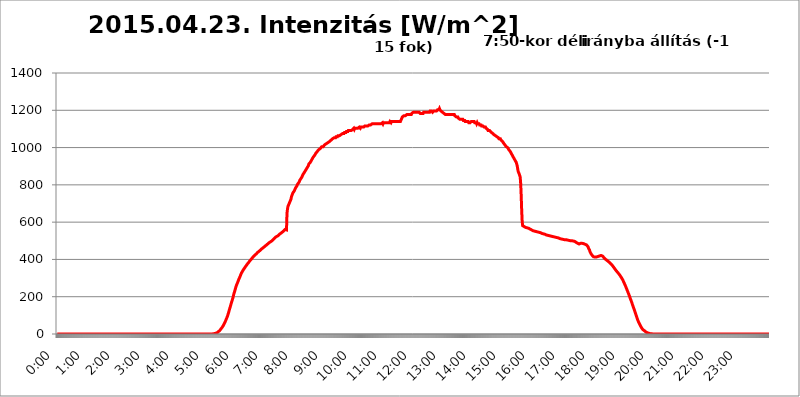
| Category | 2015.04.23. Intenzitás [W/m^2] |
|---|---|
| 0.0 | -0.256 |
| 0.0006944444444444445 | -0.256 |
| 0.001388888888888889 | -0.256 |
| 0.0020833333333333333 | -0.256 |
| 0.002777777777777778 | -0.256 |
| 0.003472222222222222 | -0.256 |
| 0.004166666666666667 | -0.256 |
| 0.004861111111111111 | -0.256 |
| 0.005555555555555556 | -0.256 |
| 0.0062499999999999995 | -0.256 |
| 0.006944444444444444 | -0.256 |
| 0.007638888888888889 | -0.256 |
| 0.008333333333333333 | -0.256 |
| 0.009027777777777779 | -0.256 |
| 0.009722222222222222 | -0.256 |
| 0.010416666666666666 | -0.256 |
| 0.011111111111111112 | -0.256 |
| 0.011805555555555555 | -0.256 |
| 0.012499999999999999 | -0.256 |
| 0.013194444444444444 | -0.256 |
| 0.013888888888888888 | -0.256 |
| 0.014583333333333332 | -0.256 |
| 0.015277777777777777 | -0.256 |
| 0.015972222222222224 | -0.256 |
| 0.016666666666666666 | -0.256 |
| 0.017361111111111112 | -0.256 |
| 0.018055555555555557 | -0.256 |
| 0.01875 | -0.256 |
| 0.019444444444444445 | -0.256 |
| 0.02013888888888889 | -0.256 |
| 0.020833333333333332 | -0.256 |
| 0.02152777777777778 | -0.256 |
| 0.022222222222222223 | -0.256 |
| 0.02291666666666667 | -0.256 |
| 0.02361111111111111 | -0.256 |
| 0.024305555555555556 | -0.256 |
| 0.024999999999999998 | -0.256 |
| 0.025694444444444447 | -0.256 |
| 0.02638888888888889 | -0.256 |
| 0.027083333333333334 | -0.256 |
| 0.027777777777777776 | -0.256 |
| 0.02847222222222222 | -0.256 |
| 0.029166666666666664 | -0.256 |
| 0.029861111111111113 | -0.256 |
| 0.030555555555555555 | -0.256 |
| 0.03125 | -0.256 |
| 0.03194444444444445 | -0.256 |
| 0.03263888888888889 | -0.256 |
| 0.03333333333333333 | -0.256 |
| 0.034027777777777775 | -0.256 |
| 0.034722222222222224 | -0.256 |
| 0.035416666666666666 | -0.256 |
| 0.036111111111111115 | -0.256 |
| 0.03680555555555556 | -0.256 |
| 0.0375 | -0.256 |
| 0.03819444444444444 | -0.256 |
| 0.03888888888888889 | -0.256 |
| 0.03958333333333333 | -0.256 |
| 0.04027777777777778 | -0.256 |
| 0.04097222222222222 | -0.256 |
| 0.041666666666666664 | -0.256 |
| 0.042361111111111106 | -0.256 |
| 0.04305555555555556 | -0.256 |
| 0.043750000000000004 | -0.256 |
| 0.044444444444444446 | -0.256 |
| 0.04513888888888889 | -0.256 |
| 0.04583333333333334 | -0.256 |
| 0.04652777777777778 | -0.256 |
| 0.04722222222222222 | -0.256 |
| 0.04791666666666666 | -0.256 |
| 0.04861111111111111 | -0.256 |
| 0.049305555555555554 | -0.256 |
| 0.049999999999999996 | -0.256 |
| 0.05069444444444445 | -0.256 |
| 0.051388888888888894 | -0.256 |
| 0.052083333333333336 | -0.256 |
| 0.05277777777777778 | -0.256 |
| 0.05347222222222222 | -0.256 |
| 0.05416666666666667 | -0.256 |
| 0.05486111111111111 | -0.256 |
| 0.05555555555555555 | -0.256 |
| 0.05625 | -0.256 |
| 0.05694444444444444 | -0.256 |
| 0.057638888888888885 | -0.256 |
| 0.05833333333333333 | -0.256 |
| 0.05902777777777778 | -0.256 |
| 0.059722222222222225 | -0.256 |
| 0.06041666666666667 | -0.256 |
| 0.061111111111111116 | -0.256 |
| 0.06180555555555556 | -0.256 |
| 0.0625 | -0.256 |
| 0.06319444444444444 | -0.256 |
| 0.06388888888888888 | -0.256 |
| 0.06458333333333334 | -0.256 |
| 0.06527777777777778 | -0.256 |
| 0.06597222222222222 | -0.256 |
| 0.06666666666666667 | -0.256 |
| 0.06736111111111111 | -0.256 |
| 0.06805555555555555 | -0.256 |
| 0.06874999999999999 | -0.256 |
| 0.06944444444444443 | -0.256 |
| 0.07013888888888889 | -0.256 |
| 0.07083333333333333 | -0.256 |
| 0.07152777777777779 | -0.256 |
| 0.07222222222222223 | -0.256 |
| 0.07291666666666667 | -0.256 |
| 0.07361111111111111 | -0.256 |
| 0.07430555555555556 | -0.256 |
| 0.075 | -0.256 |
| 0.07569444444444444 | -0.256 |
| 0.0763888888888889 | -0.256 |
| 0.07708333333333334 | -0.256 |
| 0.07777777777777778 | -0.256 |
| 0.07847222222222222 | -0.256 |
| 0.07916666666666666 | -0.256 |
| 0.0798611111111111 | -0.256 |
| 0.08055555555555556 | -0.256 |
| 0.08125 | -0.256 |
| 0.08194444444444444 | -0.256 |
| 0.08263888888888889 | -0.256 |
| 0.08333333333333333 | -0.256 |
| 0.08402777777777777 | -0.256 |
| 0.08472222222222221 | -0.256 |
| 0.08541666666666665 | -0.256 |
| 0.08611111111111112 | -0.256 |
| 0.08680555555555557 | -0.256 |
| 0.08750000000000001 | -0.256 |
| 0.08819444444444445 | -0.256 |
| 0.08888888888888889 | -0.256 |
| 0.08958333333333333 | -0.256 |
| 0.09027777777777778 | -0.256 |
| 0.09097222222222222 | -0.256 |
| 0.09166666666666667 | -0.256 |
| 0.09236111111111112 | -0.256 |
| 0.09305555555555556 | -0.256 |
| 0.09375 | -0.256 |
| 0.09444444444444444 | -0.256 |
| 0.09513888888888888 | -0.256 |
| 0.09583333333333333 | -0.256 |
| 0.09652777777777777 | -0.256 |
| 0.09722222222222222 | -0.256 |
| 0.09791666666666667 | -0.256 |
| 0.09861111111111111 | -0.256 |
| 0.09930555555555555 | -0.256 |
| 0.09999999999999999 | -0.256 |
| 0.10069444444444443 | -0.256 |
| 0.1013888888888889 | -0.256 |
| 0.10208333333333335 | -0.256 |
| 0.10277777777777779 | -0.256 |
| 0.10347222222222223 | -0.256 |
| 0.10416666666666667 | -0.256 |
| 0.10486111111111111 | -0.256 |
| 0.10555555555555556 | -0.256 |
| 0.10625 | -0.256 |
| 0.10694444444444444 | -0.256 |
| 0.1076388888888889 | -0.256 |
| 0.10833333333333334 | -0.256 |
| 0.10902777777777778 | -0.256 |
| 0.10972222222222222 | -0.256 |
| 0.1111111111111111 | -0.256 |
| 0.11180555555555556 | -0.256 |
| 0.11180555555555556 | -0.256 |
| 0.1125 | -0.256 |
| 0.11319444444444444 | -0.256 |
| 0.11388888888888889 | -0.256 |
| 0.11458333333333333 | -0.256 |
| 0.11527777777777777 | -0.256 |
| 0.11597222222222221 | -0.256 |
| 0.11666666666666665 | -0.256 |
| 0.1173611111111111 | -0.256 |
| 0.11805555555555557 | -0.256 |
| 0.11944444444444445 | -0.256 |
| 0.12013888888888889 | -0.256 |
| 0.12083333333333333 | -0.256 |
| 0.12152777777777778 | -0.256 |
| 0.12222222222222223 | -0.256 |
| 0.12291666666666667 | -0.256 |
| 0.12291666666666667 | -0.256 |
| 0.12361111111111112 | -0.256 |
| 0.12430555555555556 | -0.256 |
| 0.125 | -0.256 |
| 0.12569444444444444 | -0.256 |
| 0.12638888888888888 | -0.256 |
| 0.12708333333333333 | -0.256 |
| 0.16875 | -0.256 |
| 0.12847222222222224 | -0.256 |
| 0.12916666666666668 | -0.256 |
| 0.12986111111111112 | -0.256 |
| 0.13055555555555556 | -0.256 |
| 0.13125 | -0.256 |
| 0.13194444444444445 | -0.256 |
| 0.1326388888888889 | -0.256 |
| 0.13333333333333333 | -0.256 |
| 0.13402777777777777 | -0.256 |
| 0.13402777777777777 | -0.256 |
| 0.13472222222222222 | -0.256 |
| 0.13541666666666666 | -0.256 |
| 0.1361111111111111 | -0.256 |
| 0.13749999999999998 | -0.256 |
| 0.13819444444444443 | -0.256 |
| 0.1388888888888889 | -0.256 |
| 0.13958333333333334 | -0.256 |
| 0.14027777777777778 | -0.256 |
| 0.14097222222222222 | -0.256 |
| 0.14166666666666666 | -0.256 |
| 0.1423611111111111 | -0.256 |
| 0.14305555555555557 | -0.256 |
| 0.14375000000000002 | -0.256 |
| 0.14444444444444446 | -0.256 |
| 0.1451388888888889 | -0.256 |
| 0.1451388888888889 | -0.256 |
| 0.14652777777777778 | -0.256 |
| 0.14722222222222223 | -0.256 |
| 0.14791666666666667 | -0.256 |
| 0.1486111111111111 | -0.256 |
| 0.14930555555555555 | -0.256 |
| 0.15 | -0.256 |
| 0.15069444444444444 | -0.256 |
| 0.15138888888888888 | -0.256 |
| 0.15208333333333332 | -0.256 |
| 0.15277777777777776 | -0.256 |
| 0.15347222222222223 | -0.256 |
| 0.15416666666666667 | -0.256 |
| 0.15486111111111112 | -0.256 |
| 0.15555555555555556 | -0.256 |
| 0.15625 | -0.256 |
| 0.15694444444444444 | -0.256 |
| 0.15763888888888888 | -0.256 |
| 0.15833333333333333 | -0.256 |
| 0.15902777777777777 | -0.256 |
| 0.15972222222222224 | -0.256 |
| 0.16041666666666668 | -0.256 |
| 0.16111111111111112 | -0.256 |
| 0.16180555555555556 | -0.256 |
| 0.1625 | -0.256 |
| 0.16319444444444445 | -0.256 |
| 0.1638888888888889 | -0.256 |
| 0.16458333333333333 | -0.256 |
| 0.16527777777777777 | -0.256 |
| 0.16597222222222222 | -0.256 |
| 0.16666666666666666 | -0.256 |
| 0.1673611111111111 | -0.256 |
| 0.16805555555555554 | -0.256 |
| 0.16874999999999998 | -0.256 |
| 0.16944444444444443 | -0.256 |
| 0.17013888888888887 | -0.256 |
| 0.1708333333333333 | -0.256 |
| 0.17152777777777775 | -0.256 |
| 0.17222222222222225 | -0.256 |
| 0.1729166666666667 | -0.256 |
| 0.17361111111111113 | -0.256 |
| 0.17430555555555557 | -0.256 |
| 0.17500000000000002 | -0.256 |
| 0.17569444444444446 | -0.256 |
| 0.1763888888888889 | -0.256 |
| 0.17708333333333334 | -0.256 |
| 0.17777777777777778 | -0.256 |
| 0.17847222222222223 | -0.256 |
| 0.17916666666666667 | -0.256 |
| 0.1798611111111111 | -0.256 |
| 0.18055555555555555 | -0.256 |
| 0.18125 | -0.256 |
| 0.18194444444444444 | -0.256 |
| 0.1826388888888889 | -0.256 |
| 0.18333333333333335 | -0.256 |
| 0.1840277777777778 | -0.256 |
| 0.18472222222222223 | -0.256 |
| 0.18541666666666667 | -0.256 |
| 0.18611111111111112 | -0.256 |
| 0.18680555555555556 | -0.256 |
| 0.1875 | -0.256 |
| 0.18819444444444444 | -0.256 |
| 0.18888888888888888 | -0.256 |
| 0.18958333333333333 | -0.256 |
| 0.19027777777777777 | -0.256 |
| 0.1909722222222222 | -0.256 |
| 0.19166666666666665 | -0.256 |
| 0.19236111111111112 | -0.256 |
| 0.19305555555555554 | -0.256 |
| 0.19375 | -0.256 |
| 0.19444444444444445 | -0.256 |
| 0.1951388888888889 | -0.256 |
| 0.19583333333333333 | -0.256 |
| 0.19652777777777777 | -0.256 |
| 0.19722222222222222 | -0.256 |
| 0.19791666666666666 | -0.256 |
| 0.1986111111111111 | -0.256 |
| 0.19930555555555554 | -0.256 |
| 0.19999999999999998 | -0.256 |
| 0.20069444444444443 | -0.256 |
| 0.20138888888888887 | -0.256 |
| 0.2020833333333333 | -0.256 |
| 0.2027777777777778 | -0.256 |
| 0.2034722222222222 | -0.256 |
| 0.2041666666666667 | -0.256 |
| 0.20486111111111113 | -0.256 |
| 0.20555555555555557 | -0.256 |
| 0.20625000000000002 | -0.256 |
| 0.20694444444444446 | -0.256 |
| 0.2076388888888889 | -0.256 |
| 0.20833333333333334 | -0.256 |
| 0.20902777777777778 | -0.256 |
| 0.20972222222222223 | -0.256 |
| 0.21041666666666667 | -0.256 |
| 0.2111111111111111 | -0.256 |
| 0.21180555555555555 | -0.256 |
| 0.2125 | -0.256 |
| 0.21319444444444444 | -0.256 |
| 0.2138888888888889 | -0.256 |
| 0.21458333333333335 | -0.256 |
| 0.2152777777777778 | -0.256 |
| 0.21597222222222223 | -0.256 |
| 0.21666666666666667 | -0.256 |
| 0.21736111111111112 | -0.256 |
| 0.21805555555555556 | 1.09 |
| 0.21875 | 1.09 |
| 0.21944444444444444 | 1.09 |
| 0.22013888888888888 | 1.09 |
| 0.22083333333333333 | 2.439 |
| 0.22152777777777777 | 3.791 |
| 0.2222222222222222 | 3.791 |
| 0.22291666666666665 | 5.146 |
| 0.2236111111111111 | 6.503 |
| 0.22430555555555556 | 7.862 |
| 0.225 | 9.225 |
| 0.22569444444444445 | 11.956 |
| 0.2263888888888889 | 13.325 |
| 0.22708333333333333 | 16.069 |
| 0.22777777777777777 | 18.822 |
| 0.22847222222222222 | 21.582 |
| 0.22916666666666666 | 25.736 |
| 0.2298611111111111 | 28.514 |
| 0.23055555555555554 | 31.297 |
| 0.23124999999999998 | 35.483 |
| 0.23194444444444443 | 39.68 |
| 0.23263888888888887 | 43.886 |
| 0.2333333333333333 | 48.1 |
| 0.2340277777777778 | 53.73 |
| 0.2347222222222222 | 59.368 |
| 0.2354166666666667 | 65.012 |
| 0.23611111111111113 | 70.658 |
| 0.23680555555555557 | 77.715 |
| 0.23750000000000002 | 83.356 |
| 0.23819444444444446 | 90.399 |
| 0.2388888888888889 | 97.427 |
| 0.23958333333333334 | 105.834 |
| 0.24027777777777778 | 114.207 |
| 0.24097222222222223 | 123.922 |
| 0.24166666666666667 | 133.57 |
| 0.2423611111111111 | 141.782 |
| 0.24305555555555555 | 151.286 |
| 0.24375 | 160.704 |
| 0.24444444444444446 | 170.029 |
| 0.24513888888888888 | 177.946 |
| 0.24583333333333335 | 187.091 |
| 0.2465277777777778 | 196.135 |
| 0.24722222222222223 | 207.615 |
| 0.24791666666666667 | 217.681 |
| 0.24861111111111112 | 226.383 |
| 0.24930555555555556 | 234.99 |
| 0.25 | 244.717 |
| 0.25069444444444444 | 254.333 |
| 0.2513888888888889 | 261.48 |
| 0.2520833333333333 | 268.576 |
| 0.25277777777777777 | 274.454 |
| 0.2534722222222222 | 281.471 |
| 0.25416666666666665 | 288.455 |
| 0.2548611111111111 | 295.413 |
| 0.2555555555555556 | 301.198 |
| 0.25625000000000003 | 306.974 |
| 0.2569444444444445 | 313.904 |
| 0.2576388888888889 | 320.84 |
| 0.25833333333333336 | 326.633 |
| 0.2590277777777778 | 331.279 |
| 0.25972222222222224 | 335.941 |
| 0.2604166666666667 | 340.62 |
| 0.2611111111111111 | 345.322 |
| 0.26180555555555557 | 348.865 |
| 0.2625 | 352.423 |
| 0.26319444444444445 | 357.196 |
| 0.2638888888888889 | 360.798 |
| 0.26458333333333334 | 364.422 |
| 0.2652777777777778 | 368.07 |
| 0.2659722222222222 | 371.742 |
| 0.26666666666666666 | 375.442 |
| 0.2673611111111111 | 377.925 |
| 0.26805555555555555 | 381.674 |
| 0.26875 | 385.455 |
| 0.26944444444444443 | 389.27 |
| 0.2701388888888889 | 391.834 |
| 0.2708333333333333 | 395.711 |
| 0.27152777777777776 | 398.318 |
| 0.2722222222222222 | 400.943 |
| 0.27291666666666664 | 404.916 |
| 0.2736111111111111 | 407.589 |
| 0.2743055555555555 | 411.638 |
| 0.27499999999999997 | 414.364 |
| 0.27569444444444446 | 417.112 |
| 0.27638888888888885 | 419.883 |
| 0.27708333333333335 | 422.678 |
| 0.2777777777777778 | 424.085 |
| 0.27847222222222223 | 426.916 |
| 0.2791666666666667 | 429.773 |
| 0.2798611111111111 | 432.656 |
| 0.28055555555555556 | 435.566 |
| 0.28125 | 438.503 |
| 0.28194444444444444 | 439.982 |
| 0.2826388888888889 | 442.962 |
| 0.2833333333333333 | 444.463 |
| 0.28402777777777777 | 445.971 |
| 0.2847222222222222 | 449.011 |
| 0.28541666666666665 | 450.542 |
| 0.28611111111111115 | 453.629 |
| 0.28680555555555554 | 456.747 |
| 0.28750000000000003 | 458.318 |
| 0.2881944444444445 | 461.486 |
| 0.2888888888888889 | 463.083 |
| 0.28958333333333336 | 464.688 |
| 0.2902777777777778 | 467.925 |
| 0.29097222222222224 | 469.557 |
| 0.2916666666666667 | 472.848 |
| 0.2923611111111111 | 474.507 |
| 0.29305555555555557 | 476.176 |
| 0.29375 | 479.541 |
| 0.29444444444444445 | 481.238 |
| 0.2951388888888889 | 482.945 |
| 0.29583333333333334 | 484.662 |
| 0.2965277777777778 | 486.389 |
| 0.2972222222222222 | 489.873 |
| 0.29791666666666666 | 491.63 |
| 0.2986111111111111 | 493.398 |
| 0.29930555555555555 | 495.176 |
| 0.3 | 496.965 |
| 0.30069444444444443 | 498.764 |
| 0.3013888888888889 | 500.575 |
| 0.3020833333333333 | 504.229 |
| 0.30277777777777776 | 506.072 |
| 0.3034722222222222 | 507.927 |
| 0.30416666666666664 | 511.671 |
| 0.3048611111111111 | 513.561 |
| 0.3055555555555555 | 517.375 |
| 0.30624999999999997 | 519.3 |
| 0.3069444444444444 | 521.237 |
| 0.3076388888888889 | 523.186 |
| 0.30833333333333335 | 525.148 |
| 0.3090277777777778 | 527.122 |
| 0.30972222222222223 | 527.122 |
| 0.3104166666666667 | 531.108 |
| 0.3111111111111111 | 533.12 |
| 0.31180555555555556 | 535.145 |
| 0.3125 | 537.182 |
| 0.31319444444444444 | 539.234 |
| 0.3138888888888889 | 539.234 |
| 0.3145833333333333 | 543.376 |
| 0.31527777777777777 | 545.467 |
| 0.3159722222222222 | 547.572 |
| 0.31666666666666665 | 549.691 |
| 0.31736111111111115 | 551.823 |
| 0.31805555555555554 | 556.131 |
| 0.31875000000000003 | 556.131 |
| 0.3194444444444445 | 560.495 |
| 0.3201388888888889 | 560.495 |
| 0.32083333333333336 | 562.699 |
| 0.3215277777777778 | 558.305 |
| 0.32222222222222224 | 647.179 |
| 0.3229166666666667 | 670.078 |
| 0.3236111111111111 | 685.046 |
| 0.32430555555555557 | 691.18 |
| 0.325 | 697.399 |
| 0.32569444444444445 | 703.704 |
| 0.3263888888888889 | 710.098 |
| 0.32708333333333334 | 716.58 |
| 0.3277777777777778 | 723.153 |
| 0.3284722222222222 | 736.574 |
| 0.32916666666666666 | 743.425 |
| 0.3298611111111111 | 750.371 |
| 0.33055555555555555 | 757.414 |
| 0.33125 | 760.972 |
| 0.33194444444444443 | 764.555 |
| 0.3326388888888889 | 768.162 |
| 0.3333333333333333 | 775.451 |
| 0.3340277777777778 | 779.134 |
| 0.3347222222222222 | 786.575 |
| 0.3354166666666667 | 790.334 |
| 0.3361111111111111 | 794.119 |
| 0.3368055555555556 | 801.768 |
| 0.33749999999999997 | 805.632 |
| 0.33819444444444446 | 809.522 |
| 0.33888888888888885 | 813.439 |
| 0.33958333333333335 | 817.382 |
| 0.34027777777777773 | 825.351 |
| 0.34097222222222223 | 829.377 |
| 0.3416666666666666 | 833.43 |
| 0.3423611111111111 | 837.51 |
| 0.3430555555555555 | 841.619 |
| 0.34375 | 845.755 |
| 0.3444444444444445 | 854.113 |
| 0.3451388888888889 | 858.335 |
| 0.3458333333333334 | 858.335 |
| 0.34652777777777777 | 866.865 |
| 0.34722222222222227 | 871.173 |
| 0.34791666666666665 | 875.511 |
| 0.34861111111111115 | 879.878 |
| 0.34930555555555554 | 884.274 |
| 0.35000000000000003 | 888.701 |
| 0.3506944444444444 | 893.157 |
| 0.3513888888888889 | 897.643 |
| 0.3520833333333333 | 902.16 |
| 0.3527777777777778 | 911.285 |
| 0.3534722222222222 | 911.285 |
| 0.3541666666666667 | 915.893 |
| 0.3548611111111111 | 920.533 |
| 0.35555555555555557 | 925.203 |
| 0.35625 | 929.905 |
| 0.35694444444444445 | 934.639 |
| 0.3576388888888889 | 939.404 |
| 0.35833333333333334 | 944.201 |
| 0.3590277777777778 | 949.03 |
| 0.3597222222222222 | 949.03 |
| 0.36041666666666666 | 953.892 |
| 0.3611111111111111 | 958.785 |
| 0.36180555555555555 | 963.712 |
| 0.3625 | 968.671 |
| 0.36319444444444443 | 968.671 |
| 0.3638888888888889 | 973.663 |
| 0.3645833333333333 | 978.688 |
| 0.3652777777777778 | 983.747 |
| 0.3659722222222222 | 983.747 |
| 0.3666666666666667 | 988.839 |
| 0.3673611111111111 | 993.965 |
| 0.3680555555555556 | 993.965 |
| 0.36874999999999997 | 993.965 |
| 0.36944444444444446 | 999.125 |
| 0.37013888888888885 | 999.125 |
| 0.37083333333333335 | 1004.318 |
| 0.37152777777777773 | 1004.318 |
| 0.37222222222222223 | 1004.318 |
| 0.3729166666666666 | 1004.318 |
| 0.3736111111111111 | 1009.546 |
| 0.3743055555555555 | 1009.546 |
| 0.375 | 1014.809 |
| 0.3756944444444445 | 1014.809 |
| 0.3763888888888889 | 1014.809 |
| 0.3770833333333334 | 1020.106 |
| 0.37777777777777777 | 1020.106 |
| 0.37847222222222227 | 1025.437 |
| 0.37916666666666665 | 1025.437 |
| 0.37986111111111115 | 1025.437 |
| 0.38055555555555554 | 1025.437 |
| 0.38125000000000003 | 1030.804 |
| 0.3819444444444444 | 1030.804 |
| 0.3826388888888889 | 1036.206 |
| 0.3833333333333333 | 1036.206 |
| 0.3840277777777778 | 1036.206 |
| 0.3847222222222222 | 1041.644 |
| 0.3854166666666667 | 1041.644 |
| 0.3861111111111111 | 1047.117 |
| 0.38680555555555557 | 1047.117 |
| 0.3875 | 1047.117 |
| 0.38819444444444445 | 1052.625 |
| 0.3888888888888889 | 1052.625 |
| 0.38958333333333334 | 1052.625 |
| 0.3902777777777778 | 1052.625 |
| 0.3909722222222222 | 1058.17 |
| 0.39166666666666666 | 1058.17 |
| 0.3923611111111111 | 1058.17 |
| 0.39305555555555555 | 1058.17 |
| 0.39375 | 1063.751 |
| 0.39444444444444443 | 1063.751 |
| 0.3951388888888889 | 1063.751 |
| 0.3958333333333333 | 1063.751 |
| 0.3965277777777778 | 1063.751 |
| 0.3972222222222222 | 1063.751 |
| 0.3979166666666667 | 1069.368 |
| 0.3986111111111111 | 1069.368 |
| 0.3993055555555556 | 1069.368 |
| 0.39999999999999997 | 1075.021 |
| 0.40069444444444446 | 1075.021 |
| 0.40138888888888885 | 1075.021 |
| 0.40208333333333335 | 1075.021 |
| 0.40277777777777773 | 1080.711 |
| 0.40347222222222223 | 1080.711 |
| 0.4041666666666666 | 1080.711 |
| 0.4048611111111111 | 1080.711 |
| 0.4055555555555555 | 1086.439 |
| 0.40625 | 1086.439 |
| 0.4069444444444445 | 1086.439 |
| 0.4076388888888889 | 1086.439 |
| 0.4083333333333334 | 1092.203 |
| 0.40902777777777777 | 1092.203 |
| 0.40972222222222227 | 1092.203 |
| 0.41041666666666665 | 1092.203 |
| 0.41111111111111115 | 1092.203 |
| 0.41180555555555554 | 1092.203 |
| 0.41250000000000003 | 1092.203 |
| 0.4131944444444444 | 1092.203 |
| 0.4138888888888889 | 1092.203 |
| 0.4145833333333333 | 1098.004 |
| 0.4152777777777778 | 1098.004 |
| 0.4159722222222222 | 1103.843 |
| 0.4166666666666667 | 1098.004 |
| 0.4173611111111111 | 1103.843 |
| 0.41805555555555557 | 1103.843 |
| 0.41875 | 1103.843 |
| 0.41944444444444445 | 1103.843 |
| 0.4201388888888889 | 1103.843 |
| 0.42083333333333334 | 1103.843 |
| 0.4215277777777778 | 1103.843 |
| 0.4222222222222222 | 1103.843 |
| 0.42291666666666666 | 1103.843 |
| 0.4236111111111111 | 1109.72 |
| 0.42430555555555555 | 1109.72 |
| 0.425 | 1103.843 |
| 0.42569444444444443 | 1109.72 |
| 0.4263888888888889 | 1109.72 |
| 0.4270833333333333 | 1109.72 |
| 0.4277777777777778 | 1109.72 |
| 0.4284722222222222 | 1109.72 |
| 0.4291666666666667 | 1109.72 |
| 0.4298611111111111 | 1109.72 |
| 0.4305555555555556 | 1109.72 |
| 0.43124999999999997 | 1115.634 |
| 0.43194444444444446 | 1115.634 |
| 0.43263888888888885 | 1115.634 |
| 0.43333333333333335 | 1115.634 |
| 0.43402777777777773 | 1115.634 |
| 0.43472222222222223 | 1115.634 |
| 0.4354166666666666 | 1115.634 |
| 0.4361111111111111 | 1115.634 |
| 0.4368055555555555 | 1115.634 |
| 0.4375 | 1121.587 |
| 0.4381944444444445 | 1121.587 |
| 0.4388888888888889 | 1121.587 |
| 0.4395833333333334 | 1121.587 |
| 0.44027777777777777 | 1121.587 |
| 0.44097222222222227 | 1121.587 |
| 0.44166666666666665 | 1127.578 |
| 0.44236111111111115 | 1127.578 |
| 0.44305555555555554 | 1127.578 |
| 0.44375000000000003 | 1127.578 |
| 0.4444444444444444 | 1127.578 |
| 0.4451388888888889 | 1127.578 |
| 0.4458333333333333 | 1127.578 |
| 0.4465277777777778 | 1127.578 |
| 0.4472222222222222 | 1127.578 |
| 0.4479166666666667 | 1127.578 |
| 0.4486111111111111 | 1127.578 |
| 0.44930555555555557 | 1127.578 |
| 0.45 | 1127.578 |
| 0.45069444444444445 | 1127.578 |
| 0.4513888888888889 | 1127.578 |
| 0.45208333333333334 | 1127.578 |
| 0.4527777777777778 | 1127.578 |
| 0.4534722222222222 | 1127.578 |
| 0.45416666666666666 | 1127.578 |
| 0.4548611111111111 | 1127.578 |
| 0.45555555555555555 | 1127.578 |
| 0.45625 | 1133.607 |
| 0.45694444444444443 | 1127.578 |
| 0.4576388888888889 | 1133.607 |
| 0.4583333333333333 | 1133.607 |
| 0.4590277777777778 | 1133.607 |
| 0.4597222222222222 | 1133.607 |
| 0.4604166666666667 | 1133.607 |
| 0.4611111111111111 | 1133.607 |
| 0.4618055555555556 | 1133.607 |
| 0.46249999999999997 | 1133.607 |
| 0.46319444444444446 | 1133.607 |
| 0.46388888888888885 | 1133.607 |
| 0.46458333333333335 | 1133.607 |
| 0.46527777777777773 | 1133.607 |
| 0.46597222222222223 | 1133.607 |
| 0.4666666666666666 | 1139.675 |
| 0.4673611111111111 | 1139.675 |
| 0.4680555555555555 | 1133.607 |
| 0.46875 | 1139.675 |
| 0.4694444444444445 | 1139.675 |
| 0.4701388888888889 | 1139.675 |
| 0.4708333333333334 | 1139.675 |
| 0.47152777777777777 | 1139.675 |
| 0.47222222222222227 | 1139.675 |
| 0.47291666666666665 | 1139.675 |
| 0.47361111111111115 | 1139.675 |
| 0.47430555555555554 | 1139.675 |
| 0.47500000000000003 | 1139.675 |
| 0.4756944444444444 | 1139.675 |
| 0.4763888888888889 | 1139.675 |
| 0.4770833333333333 | 1139.675 |
| 0.4777777777777778 | 1139.675 |
| 0.4784722222222222 | 1139.675 |
| 0.4791666666666667 | 1139.675 |
| 0.4798611111111111 | 1139.675 |
| 0.48055555555555557 | 1139.675 |
| 0.48125 | 1139.675 |
| 0.48194444444444445 | 1145.782 |
| 0.4826388888888889 | 1151.928 |
| 0.48333333333333334 | 1158.113 |
| 0.4840277777777778 | 1164.337 |
| 0.4847222222222222 | 1164.337 |
| 0.48541666666666666 | 1164.337 |
| 0.4861111111111111 | 1170.601 |
| 0.48680555555555555 | 1170.601 |
| 0.4875 | 1170.601 |
| 0.48819444444444443 | 1170.601 |
| 0.4888888888888889 | 1170.601 |
| 0.4895833333333333 | 1170.601 |
| 0.4902777777777778 | 1176.905 |
| 0.4909722222222222 | 1176.905 |
| 0.4916666666666667 | 1176.905 |
| 0.4923611111111111 | 1176.905 |
| 0.4930555555555556 | 1176.905 |
| 0.49374999999999997 | 1176.905 |
| 0.49444444444444446 | 1176.905 |
| 0.49513888888888885 | 1176.905 |
| 0.49583333333333335 | 1176.905 |
| 0.49652777777777773 | 1176.905 |
| 0.49722222222222223 | 1183.249 |
| 0.4979166666666666 | 1183.249 |
| 0.4986111111111111 | 1183.249 |
| 0.4993055555555555 | 1189.633 |
| 0.5 | 1189.633 |
| 0.5006944444444444 | 1189.633 |
| 0.5013888888888889 | 1189.633 |
| 0.5020833333333333 | 1189.633 |
| 0.5027777777777778 | 1189.633 |
| 0.5034722222222222 | 1189.633 |
| 0.5041666666666667 | 1189.633 |
| 0.5048611111111111 | 1189.633 |
| 0.5055555555555555 | 1189.633 |
| 0.50625 | 1189.633 |
| 0.5069444444444444 | 1189.633 |
| 0.5076388888888889 | 1189.633 |
| 0.5083333333333333 | 1189.633 |
| 0.5090277777777777 | 1183.249 |
| 0.5097222222222222 | 1183.249 |
| 0.5104166666666666 | 1183.249 |
| 0.5111111111111112 | 1183.249 |
| 0.5118055555555555 | 1183.249 |
| 0.5125000000000001 | 1183.249 |
| 0.5131944444444444 | 1183.249 |
| 0.513888888888889 | 1189.633 |
| 0.5145833333333333 | 1189.633 |
| 0.5152777777777778 | 1189.633 |
| 0.5159722222222222 | 1189.633 |
| 0.5166666666666667 | 1189.633 |
| 0.517361111111111 | 1189.633 |
| 0.5180555555555556 | 1189.633 |
| 0.5187499999999999 | 1189.633 |
| 0.5194444444444445 | 1189.633 |
| 0.5201388888888888 | 1189.633 |
| 0.5208333333333334 | 1189.633 |
| 0.5215277777777778 | 1189.633 |
| 0.5222222222222223 | 1189.633 |
| 0.5229166666666667 | 1196.058 |
| 0.5236111111111111 | 1196.058 |
| 0.5243055555555556 | 1196.058 |
| 0.525 | 1196.058 |
| 0.5256944444444445 | 1196.058 |
| 0.5263888888888889 | 1189.633 |
| 0.5270833333333333 | 1189.633 |
| 0.5277777777777778 | 1196.058 |
| 0.5284722222222222 | 1196.058 |
| 0.5291666666666667 | 1196.058 |
| 0.5298611111111111 | 1196.058 |
| 0.5305555555555556 | 1196.058 |
| 0.53125 | 1196.058 |
| 0.5319444444444444 | 1196.058 |
| 0.5326388888888889 | 1196.058 |
| 0.5333333333333333 | 1202.523 |
| 0.5340277777777778 | 1202.523 |
| 0.5347222222222222 | 1202.523 |
| 0.5354166666666667 | 1202.523 |
| 0.5361111111111111 | 1209.029 |
| 0.5368055555555555 | 1202.523 |
| 0.5375 | 1202.523 |
| 0.5381944444444444 | 1196.058 |
| 0.5388888888888889 | 1196.058 |
| 0.5395833333333333 | 1196.058 |
| 0.5402777777777777 | 1189.633 |
| 0.5409722222222222 | 1189.633 |
| 0.5416666666666666 | 1189.633 |
| 0.5423611111111112 | 1183.249 |
| 0.5430555555555555 | 1183.249 |
| 0.5437500000000001 | 1183.249 |
| 0.5444444444444444 | 1176.905 |
| 0.545138888888889 | 1176.905 |
| 0.5458333333333333 | 1176.905 |
| 0.5465277777777778 | 1176.905 |
| 0.5472222222222222 | 1176.905 |
| 0.5479166666666667 | 1176.905 |
| 0.548611111111111 | 1176.905 |
| 0.5493055555555556 | 1176.905 |
| 0.5499999999999999 | 1176.905 |
| 0.5506944444444445 | 1176.905 |
| 0.5513888888888888 | 1176.905 |
| 0.5520833333333334 | 1176.905 |
| 0.5527777777777778 | 1176.905 |
| 0.5534722222222223 | 1176.905 |
| 0.5541666666666667 | 1176.905 |
| 0.5548611111111111 | 1176.905 |
| 0.5555555555555556 | 1176.905 |
| 0.55625 | 1176.905 |
| 0.5569444444444445 | 1176.905 |
| 0.5576388888888889 | 1170.601 |
| 0.5583333333333333 | 1170.601 |
| 0.5590277777777778 | 1170.601 |
| 0.5597222222222222 | 1164.337 |
| 0.5604166666666667 | 1164.337 |
| 0.5611111111111111 | 1164.337 |
| 0.5618055555555556 | 1164.337 |
| 0.5625 | 1158.113 |
| 0.5631944444444444 | 1158.113 |
| 0.5638888888888889 | 1158.113 |
| 0.5645833333333333 | 1151.928 |
| 0.5652777777777778 | 1151.928 |
| 0.5659722222222222 | 1151.928 |
| 0.5666666666666667 | 1151.928 |
| 0.5673611111111111 | 1151.928 |
| 0.5680555555555555 | 1151.928 |
| 0.56875 | 1151.928 |
| 0.5694444444444444 | 1145.782 |
| 0.5701388888888889 | 1145.782 |
| 0.5708333333333333 | 1145.782 |
| 0.5715277777777777 | 1145.782 |
| 0.5722222222222222 | 1139.675 |
| 0.5729166666666666 | 1139.675 |
| 0.5736111111111112 | 1139.675 |
| 0.5743055555555555 | 1139.675 |
| 0.5750000000000001 | 1139.675 |
| 0.5756944444444444 | 1139.675 |
| 0.576388888888889 | 1139.675 |
| 0.5770833333333333 | 1133.607 |
| 0.5777777777777778 | 1133.607 |
| 0.5784722222222222 | 1133.607 |
| 0.5791666666666667 | 1133.607 |
| 0.579861111111111 | 1133.607 |
| 0.5805555555555556 | 1139.675 |
| 0.5812499999999999 | 1139.675 |
| 0.5819444444444445 | 1139.675 |
| 0.5826388888888888 | 1139.675 |
| 0.5833333333333334 | 1139.675 |
| 0.5840277777777778 | 1139.675 |
| 0.5847222222222223 | 1139.675 |
| 0.5854166666666667 | 1133.607 |
| 0.5861111111111111 | 1133.607 |
| 0.5868055555555556 | 1133.607 |
| 0.5875 | 1133.607 |
| 0.5881944444444445 | 1127.578 |
| 0.5888888888888889 | 1133.607 |
| 0.5895833333333333 | 1127.578 |
| 0.5902777777777778 | 1127.578 |
| 0.5909722222222222 | 1127.578 |
| 0.5916666666666667 | 1127.578 |
| 0.5923611111111111 | 1121.587 |
| 0.5930555555555556 | 1121.587 |
| 0.59375 | 1121.587 |
| 0.5944444444444444 | 1121.587 |
| 0.5951388888888889 | 1115.634 |
| 0.5958333333333333 | 1115.634 |
| 0.5965277777777778 | 1115.634 |
| 0.5972222222222222 | 1115.634 |
| 0.5979166666666667 | 1115.634 |
| 0.5986111111111111 | 1109.72 |
| 0.5993055555555555 | 1109.72 |
| 0.6 | 1109.72 |
| 0.6006944444444444 | 1109.72 |
| 0.6013888888888889 | 1103.843 |
| 0.6020833333333333 | 1103.843 |
| 0.6027777777777777 | 1103.843 |
| 0.6034722222222222 | 1098.004 |
| 0.6041666666666666 | 1092.203 |
| 0.6048611111111112 | 1092.203 |
| 0.6055555555555555 | 1092.203 |
| 0.6062500000000001 | 1092.203 |
| 0.6069444444444444 | 1092.203 |
| 0.607638888888889 | 1086.439 |
| 0.6083333333333333 | 1086.439 |
| 0.6090277777777778 | 1080.711 |
| 0.6097222222222222 | 1080.711 |
| 0.6104166666666667 | 1080.711 |
| 0.611111111111111 | 1075.021 |
| 0.6118055555555556 | 1075.021 |
| 0.6124999999999999 | 1069.368 |
| 0.6131944444444445 | 1069.368 |
| 0.6138888888888888 | 1069.368 |
| 0.6145833333333334 | 1063.751 |
| 0.6152777777777778 | 1063.751 |
| 0.6159722222222223 | 1063.751 |
| 0.6166666666666667 | 1058.17 |
| 0.6173611111111111 | 1058.17 |
| 0.6180555555555556 | 1058.17 |
| 0.61875 | 1052.625 |
| 0.6194444444444445 | 1047.117 |
| 0.6201388888888889 | 1047.117 |
| 0.6208333333333333 | 1047.117 |
| 0.6215277777777778 | 1047.117 |
| 0.6222222222222222 | 1041.644 |
| 0.6229166666666667 | 1041.644 |
| 0.6236111111111111 | 1036.206 |
| 0.6243055555555556 | 1036.206 |
| 0.625 | 1030.804 |
| 0.6256944444444444 | 1025.437 |
| 0.6263888888888889 | 1020.106 |
| 0.6270833333333333 | 1020.106 |
| 0.6277777777777778 | 1014.809 |
| 0.6284722222222222 | 1014.809 |
| 0.6291666666666667 | 1009.546 |
| 0.6298611111111111 | 1004.318 |
| 0.6305555555555555 | 1004.318 |
| 0.63125 | 999.125 |
| 0.6319444444444444 | 999.125 |
| 0.6326388888888889 | 993.965 |
| 0.6333333333333333 | 988.839 |
| 0.6340277777777777 | 988.839 |
| 0.6347222222222222 | 983.747 |
| 0.6354166666666666 | 978.688 |
| 0.6361111111111112 | 973.663 |
| 0.6368055555555555 | 968.671 |
| 0.6375000000000001 | 963.712 |
| 0.6381944444444444 | 958.785 |
| 0.638888888888889 | 953.892 |
| 0.6395833333333333 | 949.03 |
| 0.6402777777777778 | 944.201 |
| 0.6409722222222222 | 939.404 |
| 0.6416666666666667 | 934.639 |
| 0.642361111111111 | 929.905 |
| 0.6430555555555556 | 925.203 |
| 0.6437499999999999 | 920.533 |
| 0.6444444444444445 | 915.893 |
| 0.6451388888888888 | 902.16 |
| 0.6458333333333334 | 884.274 |
| 0.6465277777777778 | 871.173 |
| 0.6472222222222223 | 866.865 |
| 0.6479166666666667 | 858.335 |
| 0.6486111111111111 | 849.92 |
| 0.6493055555555556 | 841.619 |
| 0.65 | 805.632 |
| 0.6506944444444445 | 743.425 |
| 0.6513888888888889 | 664.234 |
| 0.6520833333333333 | 602.505 |
| 0.6527777777777778 | 580.866 |
| 0.6534722222222222 | 580.866 |
| 0.6541666666666667 | 578.542 |
| 0.6548611111111111 | 576.233 |
| 0.6555555555555556 | 576.233 |
| 0.65625 | 573.939 |
| 0.6569444444444444 | 571.661 |
| 0.6576388888888889 | 571.661 |
| 0.6583333333333333 | 571.661 |
| 0.6590277777777778 | 569.398 |
| 0.6597222222222222 | 569.398 |
| 0.6604166666666667 | 569.398 |
| 0.6611111111111111 | 567.15 |
| 0.6618055555555555 | 564.917 |
| 0.6625 | 564.917 |
| 0.6631944444444444 | 562.699 |
| 0.6638888888888889 | 560.495 |
| 0.6645833333333333 | 560.495 |
| 0.6652777777777777 | 558.305 |
| 0.6659722222222222 | 558.305 |
| 0.6666666666666666 | 556.131 |
| 0.6673611111111111 | 553.97 |
| 0.6680555555555556 | 551.823 |
| 0.6687500000000001 | 551.823 |
| 0.6694444444444444 | 551.823 |
| 0.6701388888888888 | 549.691 |
| 0.6708333333333334 | 549.691 |
| 0.6715277777777778 | 549.691 |
| 0.6722222222222222 | 547.572 |
| 0.6729166666666666 | 547.572 |
| 0.6736111111111112 | 547.572 |
| 0.6743055555555556 | 547.572 |
| 0.6749999999999999 | 545.467 |
| 0.6756944444444444 | 545.467 |
| 0.6763888888888889 | 543.376 |
| 0.6770833333333334 | 543.376 |
| 0.6777777777777777 | 543.376 |
| 0.6784722222222223 | 541.298 |
| 0.6791666666666667 | 541.298 |
| 0.6798611111111111 | 539.234 |
| 0.6805555555555555 | 539.234 |
| 0.68125 | 537.182 |
| 0.6819444444444445 | 537.182 |
| 0.6826388888888889 | 535.145 |
| 0.6833333333333332 | 535.145 |
| 0.6840277777777778 | 535.145 |
| 0.6847222222222222 | 533.12 |
| 0.6854166666666667 | 531.108 |
| 0.686111111111111 | 531.108 |
| 0.6868055555555556 | 531.108 |
| 0.6875 | 529.108 |
| 0.6881944444444444 | 529.108 |
| 0.688888888888889 | 527.122 |
| 0.6895833333333333 | 527.122 |
| 0.6902777777777778 | 527.122 |
| 0.6909722222222222 | 527.122 |
| 0.6916666666666668 | 527.122 |
| 0.6923611111111111 | 525.148 |
| 0.6930555555555555 | 525.148 |
| 0.69375 | 523.186 |
| 0.6944444444444445 | 523.186 |
| 0.6951388888888889 | 523.186 |
| 0.6958333333333333 | 521.237 |
| 0.6965277777777777 | 521.237 |
| 0.6972222222222223 | 521.237 |
| 0.6979166666666666 | 519.3 |
| 0.6986111111111111 | 519.3 |
| 0.6993055555555556 | 517.375 |
| 0.7000000000000001 | 517.375 |
| 0.7006944444444444 | 517.375 |
| 0.7013888888888888 | 515.462 |
| 0.7020833333333334 | 515.462 |
| 0.7027777777777778 | 515.462 |
| 0.7034722222222222 | 513.561 |
| 0.7041666666666666 | 511.671 |
| 0.7048611111111112 | 511.671 |
| 0.7055555555555556 | 511.671 |
| 0.7062499999999999 | 511.671 |
| 0.7069444444444444 | 509.793 |
| 0.7076388888888889 | 509.793 |
| 0.7083333333333334 | 509.793 |
| 0.7090277777777777 | 507.927 |
| 0.7097222222222223 | 506.072 |
| 0.7104166666666667 | 506.072 |
| 0.7111111111111111 | 506.072 |
| 0.7118055555555555 | 506.072 |
| 0.7125 | 506.072 |
| 0.7131944444444445 | 506.072 |
| 0.7138888888888889 | 504.229 |
| 0.7145833333333332 | 504.229 |
| 0.7152777777777778 | 504.229 |
| 0.7159722222222222 | 502.396 |
| 0.7166666666666667 | 502.396 |
| 0.717361111111111 | 502.396 |
| 0.7180555555555556 | 502.396 |
| 0.71875 | 502.396 |
| 0.7194444444444444 | 500.575 |
| 0.720138888888889 | 500.575 |
| 0.7208333333333333 | 500.575 |
| 0.7215277777777778 | 500.575 |
| 0.7222222222222222 | 500.575 |
| 0.7229166666666668 | 498.764 |
| 0.7236111111111111 | 498.764 |
| 0.7243055555555555 | 498.764 |
| 0.725 | 496.965 |
| 0.7256944444444445 | 496.965 |
| 0.7263888888888889 | 495.176 |
| 0.7270833333333333 | 493.398 |
| 0.7277777777777777 | 491.63 |
| 0.7284722222222223 | 489.873 |
| 0.7291666666666666 | 489.873 |
| 0.7298611111111111 | 486.389 |
| 0.7305555555555556 | 482.945 |
| 0.7312500000000001 | 482.945 |
| 0.7319444444444444 | 482.945 |
| 0.7326388888888888 | 484.662 |
| 0.7333333333333334 | 486.389 |
| 0.7340277777777778 | 486.389 |
| 0.7347222222222222 | 486.389 |
| 0.7354166666666666 | 486.389 |
| 0.7361111111111112 | 486.389 |
| 0.7368055555555556 | 486.389 |
| 0.7374999999999999 | 486.389 |
| 0.7381944444444444 | 484.662 |
| 0.7388888888888889 | 484.662 |
| 0.7395833333333334 | 482.945 |
| 0.7402777777777777 | 481.238 |
| 0.7409722222222223 | 479.541 |
| 0.7416666666666667 | 479.541 |
| 0.7423611111111111 | 477.854 |
| 0.7430555555555555 | 474.507 |
| 0.74375 | 472.848 |
| 0.7444444444444445 | 467.925 |
| 0.7451388888888889 | 459.898 |
| 0.7458333333333332 | 455.184 |
| 0.7465277777777778 | 450.542 |
| 0.7472222222222222 | 441.469 |
| 0.7479166666666667 | 435.566 |
| 0.748611111111111 | 431.211 |
| 0.7493055555555556 | 426.916 |
| 0.75 | 422.678 |
| 0.7506944444444444 | 419.883 |
| 0.751388888888889 | 417.112 |
| 0.7520833333333333 | 414.364 |
| 0.7527777777777778 | 414.364 |
| 0.7534722222222222 | 412.998 |
| 0.7541666666666668 | 412.998 |
| 0.7548611111111111 | 412.998 |
| 0.7555555555555555 | 412.998 |
| 0.75625 | 412.998 |
| 0.7569444444444445 | 414.364 |
| 0.7576388888888889 | 414.364 |
| 0.7583333333333333 | 415.735 |
| 0.7590277777777777 | 415.735 |
| 0.7597222222222223 | 417.112 |
| 0.7604166666666666 | 418.495 |
| 0.7611111111111111 | 419.883 |
| 0.7618055555555556 | 421.278 |
| 0.7625000000000001 | 421.278 |
| 0.7631944444444444 | 421.278 |
| 0.7638888888888888 | 419.883 |
| 0.7645833333333334 | 418.495 |
| 0.7652777777777778 | 415.735 |
| 0.7659722222222222 | 412.998 |
| 0.7666666666666666 | 408.934 |
| 0.7673611111111112 | 406.25 |
| 0.7680555555555556 | 403.587 |
| 0.7687499999999999 | 402.262 |
| 0.7694444444444444 | 399.628 |
| 0.7701388888888889 | 397.012 |
| 0.7708333333333334 | 395.711 |
| 0.7715277777777777 | 393.122 |
| 0.7722222222222223 | 390.55 |
| 0.7729166666666667 | 389.27 |
| 0.7736111111111111 | 386.723 |
| 0.7743055555555555 | 384.191 |
| 0.775 | 381.674 |
| 0.7756944444444445 | 379.171 |
| 0.7763888888888889 | 376.682 |
| 0.7770833333333332 | 374.206 |
| 0.7777777777777778 | 371.742 |
| 0.7784722222222222 | 368.07 |
| 0.7791666666666667 | 364.422 |
| 0.779861111111111 | 360.798 |
| 0.7805555555555556 | 357.196 |
| 0.78125 | 353.613 |
| 0.7819444444444444 | 350.049 |
| 0.782638888888889 | 346.501 |
| 0.7833333333333333 | 342.968 |
| 0.7840277777777778 | 339.449 |
| 0.7847222222222222 | 335.941 |
| 0.7854166666666668 | 332.443 |
| 0.7861111111111111 | 330.117 |
| 0.7868055555555555 | 326.633 |
| 0.7875 | 323.156 |
| 0.7881944444444445 | 319.683 |
| 0.7888888888888889 | 316.215 |
| 0.7895833333333333 | 312.749 |
| 0.7902777777777777 | 308.129 |
| 0.7909722222222223 | 304.664 |
| 0.7916666666666666 | 300.041 |
| 0.7923611111111111 | 295.413 |
| 0.7930555555555556 | 290.777 |
| 0.7937500000000001 | 284.967 |
| 0.7944444444444444 | 279.136 |
| 0.7951388888888888 | 273.281 |
| 0.7958333333333334 | 267.396 |
| 0.7965277777777778 | 261.48 |
| 0.7972222222222222 | 255.528 |
| 0.7979166666666666 | 248.335 |
| 0.7986111111111112 | 242.296 |
| 0.7993055555555556 | 234.99 |
| 0.7999999999999999 | 228.852 |
| 0.8006944444444444 | 221.422 |
| 0.8013888888888889 | 215.177 |
| 0.8020833333333334 | 207.615 |
| 0.8027777777777777 | 201.258 |
| 0.8034722222222223 | 193.561 |
| 0.8041666666666667 | 185.79 |
| 0.8048611111111111 | 179.258 |
| 0.8055555555555555 | 171.353 |
| 0.80625 | 163.378 |
| 0.8069444444444445 | 155.333 |
| 0.8076388888888889 | 148.579 |
| 0.8083333333333332 | 140.417 |
| 0.8090277777777778 | 133.57 |
| 0.8097222222222222 | 125.304 |
| 0.8104166666666667 | 116.989 |
| 0.811111111111111 | 110.025 |
| 0.8118055555555556 | 101.634 |
| 0.8125 | 93.212 |
| 0.8131944444444444 | 86.175 |
| 0.813888888888889 | 77.715 |
| 0.8145833333333333 | 70.658 |
| 0.8152777777777778 | 65.012 |
| 0.8159722222222222 | 59.368 |
| 0.8166666666666668 | 53.73 |
| 0.8173611111111111 | 48.1 |
| 0.8180555555555555 | 43.886 |
| 0.81875 | 38.28 |
| 0.8194444444444445 | 34.086 |
| 0.8201388888888889 | 29.905 |
| 0.8208333333333333 | 25.736 |
| 0.8215277777777777 | 22.965 |
| 0.8222222222222223 | 20.201 |
| 0.8229166666666666 | 18.822 |
| 0.8236111111111111 | 17.444 |
| 0.8243055555555556 | 14.696 |
| 0.8250000000000001 | 13.325 |
| 0.8256944444444444 | 10.589 |
| 0.8263888888888888 | 9.225 |
| 0.8270833333333334 | 6.503 |
| 0.8277777777777778 | 6.503 |
| 0.8284722222222222 | 5.146 |
| 0.8291666666666666 | 3.791 |
| 0.8298611111111112 | 3.791 |
| 0.8305555555555556 | 3.791 |
| 0.8312499999999999 | 2.439 |
| 0.8319444444444444 | 1.09 |
| 0.8326388888888889 | 1.09 |
| 0.8333333333333334 | 1.09 |
| 0.8340277777777777 | 1.09 |
| 0.8347222222222223 | -0.256 |
| 0.8354166666666667 | -0.256 |
| 0.8361111111111111 | -0.256 |
| 0.8368055555555555 | -0.256 |
| 0.8375 | -0.256 |
| 0.8381944444444445 | -0.256 |
| 0.8388888888888889 | -0.256 |
| 0.8395833333333332 | -0.256 |
| 0.8402777777777778 | -0.256 |
| 0.8409722222222222 | -0.256 |
| 0.8416666666666667 | -0.256 |
| 0.842361111111111 | -0.256 |
| 0.8430555555555556 | -0.256 |
| 0.84375 | -0.256 |
| 0.8444444444444444 | -0.256 |
| 0.845138888888889 | -0.256 |
| 0.8458333333333333 | -0.256 |
| 0.8465277777777778 | -0.256 |
| 0.8472222222222222 | -0.256 |
| 0.8479166666666668 | -0.256 |
| 0.8486111111111111 | -0.256 |
| 0.8493055555555555 | -0.256 |
| 0.85 | -0.256 |
| 0.8506944444444445 | -0.256 |
| 0.8513888888888889 | -0.256 |
| 0.8520833333333333 | -0.256 |
| 0.8527777777777777 | -0.256 |
| 0.8534722222222223 | -0.256 |
| 0.8541666666666666 | -0.256 |
| 0.8548611111111111 | -0.256 |
| 0.8555555555555556 | -0.256 |
| 0.8562500000000001 | -0.256 |
| 0.8569444444444444 | -0.256 |
| 0.8576388888888888 | -0.256 |
| 0.8583333333333334 | -0.256 |
| 0.8590277777777778 | -0.256 |
| 0.8597222222222222 | -0.256 |
| 0.8604166666666666 | -0.256 |
| 0.8611111111111112 | -0.256 |
| 0.8618055555555556 | -0.256 |
| 0.8624999999999999 | -0.256 |
| 0.8631944444444444 | -0.256 |
| 0.8638888888888889 | -0.256 |
| 0.8645833333333334 | -0.256 |
| 0.8652777777777777 | -0.256 |
| 0.8659722222222223 | -0.256 |
| 0.8666666666666667 | -0.256 |
| 0.8673611111111111 | -0.256 |
| 0.8680555555555555 | -0.256 |
| 0.86875 | -0.256 |
| 0.8694444444444445 | -0.256 |
| 0.8701388888888889 | -0.256 |
| 0.8708333333333332 | -0.256 |
| 0.8715277777777778 | -0.256 |
| 0.8722222222222222 | -0.256 |
| 0.8729166666666667 | -0.256 |
| 0.873611111111111 | -0.256 |
| 0.8743055555555556 | -0.256 |
| 0.875 | -0.256 |
| 0.8756944444444444 | -0.256 |
| 0.876388888888889 | -0.256 |
| 0.8770833333333333 | -0.256 |
| 0.8777777777777778 | -0.256 |
| 0.8784722222222222 | -0.256 |
| 0.8791666666666668 | -0.256 |
| 0.8798611111111111 | -0.256 |
| 0.8805555555555555 | -0.256 |
| 0.88125 | -0.256 |
| 0.8819444444444445 | -0.256 |
| 0.8826388888888889 | -0.256 |
| 0.8833333333333333 | -0.256 |
| 0.8840277777777777 | -0.256 |
| 0.8847222222222223 | -0.256 |
| 0.8854166666666666 | -0.256 |
| 0.8861111111111111 | -0.256 |
| 0.8868055555555556 | -0.256 |
| 0.8875000000000001 | -0.256 |
| 0.8881944444444444 | -0.256 |
| 0.8888888888888888 | -0.256 |
| 0.8895833333333334 | -0.256 |
| 0.8902777777777778 | -0.256 |
| 0.8909722222222222 | -0.256 |
| 0.8916666666666666 | -0.256 |
| 0.8923611111111112 | -0.256 |
| 0.8930555555555556 | -0.256 |
| 0.8937499999999999 | -0.256 |
| 0.8944444444444444 | -0.256 |
| 0.8951388888888889 | -0.256 |
| 0.8958333333333334 | -0.256 |
| 0.8965277777777777 | -0.256 |
| 0.8972222222222223 | -0.256 |
| 0.8979166666666667 | -0.256 |
| 0.8986111111111111 | -0.256 |
| 0.8993055555555555 | -0.256 |
| 0.9 | -0.256 |
| 0.9006944444444445 | -0.256 |
| 0.9013888888888889 | -0.256 |
| 0.9020833333333332 | -0.256 |
| 0.9027777777777778 | -0.256 |
| 0.9034722222222222 | -0.256 |
| 0.9041666666666667 | -0.256 |
| 0.904861111111111 | -0.256 |
| 0.9055555555555556 | -0.256 |
| 0.90625 | -0.256 |
| 0.9069444444444444 | -0.256 |
| 0.907638888888889 | -0.256 |
| 0.9083333333333333 | -0.256 |
| 0.9090277777777778 | -0.256 |
| 0.9097222222222222 | -0.256 |
| 0.9104166666666668 | -0.256 |
| 0.9111111111111111 | -0.256 |
| 0.9118055555555555 | -0.256 |
| 0.9125 | -0.256 |
| 0.9131944444444445 | -0.256 |
| 0.9138888888888889 | -0.256 |
| 0.9145833333333333 | -0.256 |
| 0.9152777777777777 | -0.256 |
| 0.9159722222222223 | -0.256 |
| 0.9166666666666666 | -0.256 |
| 0.9173611111111111 | -0.256 |
| 0.9180555555555556 | -0.256 |
| 0.9187500000000001 | -0.256 |
| 0.9194444444444444 | -0.256 |
| 0.9201388888888888 | -0.256 |
| 0.9208333333333334 | -0.256 |
| 0.9215277777777778 | -0.256 |
| 0.9222222222222222 | -0.256 |
| 0.9229166666666666 | -0.256 |
| 0.9236111111111112 | -0.256 |
| 0.9243055555555556 | -0.256 |
| 0.9249999999999999 | -0.256 |
| 0.9256944444444444 | -0.256 |
| 0.9263888888888889 | -0.256 |
| 0.9270833333333334 | -0.256 |
| 0.9277777777777777 | -0.256 |
| 0.9284722222222223 | -0.256 |
| 0.9291666666666667 | -0.256 |
| 0.9298611111111111 | -0.256 |
| 0.9305555555555555 | -0.256 |
| 0.93125 | -0.256 |
| 0.9319444444444445 | -0.256 |
| 0.9326388888888889 | -0.256 |
| 0.9333333333333332 | -0.256 |
| 0.9340277777777778 | -0.256 |
| 0.9347222222222222 | -0.256 |
| 0.9354166666666667 | -0.256 |
| 0.936111111111111 | -0.256 |
| 0.9368055555555556 | -0.256 |
| 0.9375 | -0.256 |
| 0.9381944444444444 | -0.256 |
| 0.938888888888889 | -0.256 |
| 0.9395833333333333 | -0.256 |
| 0.9402777777777778 | -0.256 |
| 0.9409722222222222 | -0.256 |
| 0.9416666666666668 | -0.256 |
| 0.9423611111111111 | -0.256 |
| 0.9430555555555555 | -0.256 |
| 0.94375 | -0.256 |
| 0.9444444444444445 | -0.256 |
| 0.9451388888888889 | -0.256 |
| 0.9458333333333333 | -0.256 |
| 0.9465277777777777 | -0.256 |
| 0.9472222222222223 | -0.256 |
| 0.9479166666666666 | -0.256 |
| 0.9486111111111111 | -0.256 |
| 0.9493055555555556 | -0.256 |
| 0.9500000000000001 | -0.256 |
| 0.9506944444444444 | -0.256 |
| 0.9513888888888888 | -0.256 |
| 0.9520833333333334 | -0.256 |
| 0.9527777777777778 | -0.256 |
| 0.9534722222222222 | -0.256 |
| 0.9541666666666666 | -0.256 |
| 0.9548611111111112 | -0.256 |
| 0.9555555555555556 | -0.256 |
| 0.9562499999999999 | -0.256 |
| 0.9569444444444444 | -0.256 |
| 0.9576388888888889 | -0.256 |
| 0.9583333333333334 | -0.256 |
| 0.9590277777777777 | -0.256 |
| 0.9597222222222223 | -0.256 |
| 0.9604166666666667 | -0.256 |
| 0.9611111111111111 | -0.256 |
| 0.9618055555555555 | -0.256 |
| 0.9625 | -0.256 |
| 0.9631944444444445 | -0.256 |
| 0.9638888888888889 | -0.256 |
| 0.9645833333333332 | -0.256 |
| 0.9652777777777778 | -0.256 |
| 0.9659722222222222 | -0.256 |
| 0.9666666666666667 | -0.256 |
| 0.967361111111111 | -0.256 |
| 0.9680555555555556 | -0.256 |
| 0.96875 | -0.256 |
| 0.9694444444444444 | -0.256 |
| 0.970138888888889 | -0.256 |
| 0.9708333333333333 | -0.256 |
| 0.9715277777777778 | -0.256 |
| 0.9722222222222222 | -0.256 |
| 0.9729166666666668 | -0.256 |
| 0.9736111111111111 | -0.256 |
| 0.9743055555555555 | -0.256 |
| 0.975 | -0.256 |
| 0.9756944444444445 | -0.256 |
| 0.9763888888888889 | -0.256 |
| 0.9770833333333333 | -0.256 |
| 0.9777777777777777 | -0.256 |
| 0.9784722222222223 | -0.256 |
| 0.9791666666666666 | -0.256 |
| 0.9798611111111111 | -0.256 |
| 0.9805555555555556 | -0.256 |
| 0.9812500000000001 | -0.256 |
| 0.9819444444444444 | -0.256 |
| 0.9826388888888888 | -0.256 |
| 0.9833333333333334 | -0.256 |
| 0.9840277777777778 | -0.256 |
| 0.9847222222222222 | -0.256 |
| 0.9854166666666666 | -0.256 |
| 0.9861111111111112 | -0.256 |
| 0.9868055555555556 | -0.256 |
| 0.9874999999999999 | -0.256 |
| 0.9881944444444444 | -0.256 |
| 0.9888888888888889 | -0.256 |
| 0.9895833333333334 | -0.256 |
| 0.9902777777777777 | -0.256 |
| 0.9909722222222223 | -0.256 |
| 0.9916666666666667 | -0.256 |
| 0.9923611111111111 | -0.256 |
| 0.9930555555555555 | -0.256 |
| 0.99375 | -0.256 |
| 0.9944444444444445 | -0.256 |
| 0.9951388888888889 | -0.256 |
| 0.9958333333333332 | -0.256 |
| 0.9965277777777778 | -0.256 |
| 0.9972222222222222 | -0.256 |
| 0.9979166666666667 | -0.256 |
| 0.998611111111111 | -0.256 |
| 0.9993055555555556 | 0 |